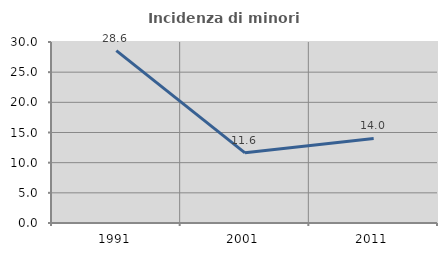
| Category | Incidenza di minori stranieri |
|---|---|
| 1991.0 | 28.571 |
| 2001.0 | 11.628 |
| 2011.0 | 14.019 |